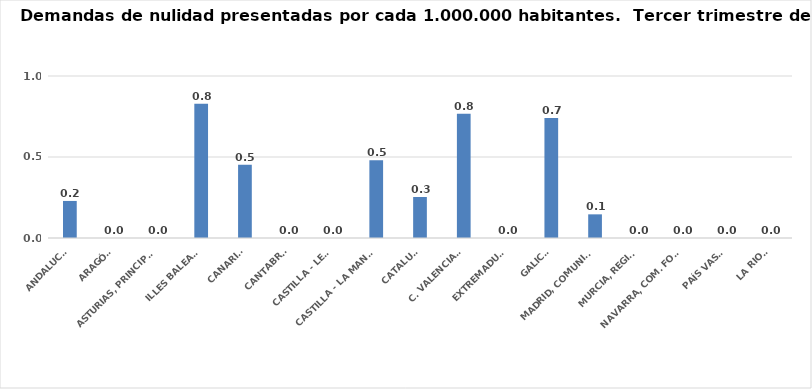
| Category | Series 0 |
|---|---|
| ANDALUCÍA | 0.229 |
| ARAGÓN | 0 |
| ASTURIAS, PRINCIPADO | 0 |
| ILLES BALEARS | 0.829 |
| CANARIAS | 0.452 |
| CANTABRIA | 0 |
| CASTILLA - LEÓN | 0 |
| CASTILLA - LA MANCHA | 0.481 |
| CATALUÑA | 0.253 |
| C. VALENCIANA | 0.767 |
| EXTREMADURA | 0 |
| GALICIA | 0.741 |
| MADRID, COMUNIDAD | 0.146 |
| MURCIA, REGIÓN | 0 |
| NAVARRA, COM. FORAL | 0 |
| PAÍS VASCO | 0 |
| LA RIOJA | 0 |